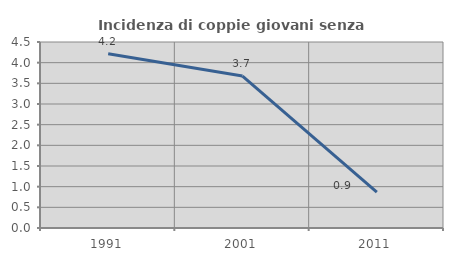
| Category | Incidenza di coppie giovani senza figli |
|---|---|
| 1991.0 | 4.218 |
| 2001.0 | 3.676 |
| 2011.0 | 0.867 |